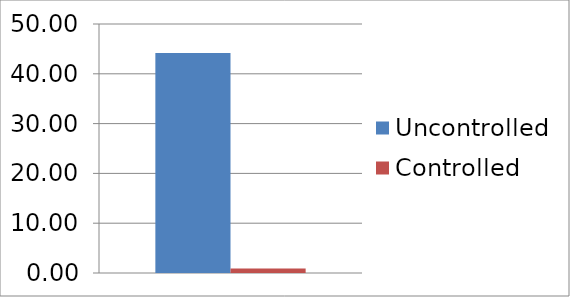
| Category | Uncontrolled | Controlled |
|---|---|---|
| Storage Tanks | 44.196 | 0.894 |